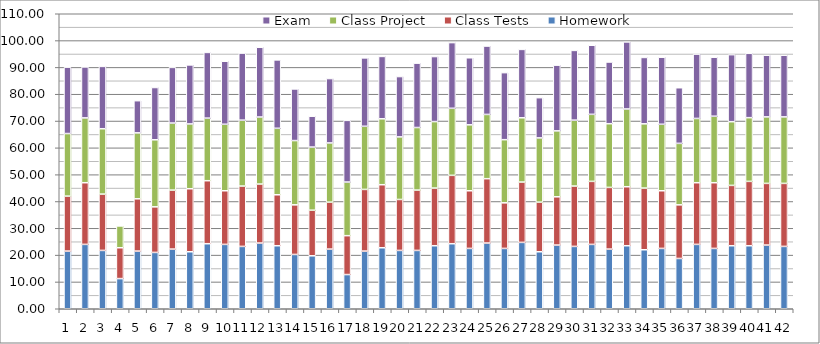
| Category | Homework | Class Tests | Class Project | Exam |
|---|---|---|---|---|
| 0 | 21.5 | 20.5 | 23.333 | 24.75 |
| 1 | 24 | 23 | 24.167 | 19 |
| 2 | 21.75 | 21 | 24.375 | 23.25 |
| 3 | 11.25 | 11.5 | 8.125 | 0 |
| 4 | 21.5 | 19.5 | 24.583 | 12 |
| 5 | 21 | 17 | 25 | 19.5 |
| 6 | 22.25 | 22 | 25 | 20.75 |
| 7 | 21.25 | 23.5 | 24.167 | 22 |
| 8 | 24.25 | 23.5 | 23.333 | 24.5 |
| 9 | 24 | 20 | 24.792 | 23.5 |
| 10 | 23.25 | 22.5 | 24.583 | 25 |
| 11 | 24.5 | 22 | 25 | 26 |
| 12 | 23.5 | 19 | 24.792 | 25.5 |
| 13 | 20.25 | 18.5 | 23.958 | 19.25 |
| 14 | 19.75 | 17 | 23.542 | 11.5 |
| 15 | 22.25 | 17.5 | 22.083 | 24 |
| 16 | 12.75 | 14.5 | 20 | 23 |
| 17 | 21.5 | 23 | 23.542 | 25.5 |
| 18 | 22.75 | 23.5 | 24.583 | 23.25 |
| 19 | 21.75 | 19 | 23.333 | 22.5 |
| 20 | 21.75 | 22.5 | 23.333 | 24 |
| 21 | 23.5 | 21.5 | 24.792 | 24.25 |
| 22 | 24.25 | 25.5 | 25 | 24.5 |
| 23 | 22.5 | 21.5 | 24.583 | 25 |
| 24 | 24.5 | 24 | 23.958 | 25.5 |
| 25 | 22.5 | 17 | 23.542 | 25 |
| 26 | 24.75 | 22.5 | 23.958 | 25.5 |
| 27 | 21.25 | 18.5 | 23.958 | 15 |
| 28 | 23.75 | 18 | 24.583 | 24.5 |
| 29 | 23.25 | 22.5 | 24.583 | 26 |
| 30 | 24 | 23.5 | 25 | 25.75 |
| 31 | 22.25 | 23 | 23.75 | 23 |
| 32 | 23.5 | 22 | 29 | 25 |
| 33 | 22 | 23 | 23.958 | 24.75 |
| 34 | 22.5 | 21.5 | 24.792 | 25 |
| 35 | 18.75 | 20 | 22.917 | 20.75 |
| 36 | 24 | 23 | 23.958 | 24 |
| 37 | 22.5 | 24.5 | 24.792 | 22 |
| 38 | 23.5 | 22.5 | 23.75 | 25 |
| 39 | 23.5 | 24 | 23.75 | 24 |
| 40 | 23.75 | 23 | 24.792 | 23 |
| 41 | 23.25 | 23.5 | 24.792 | 23 |